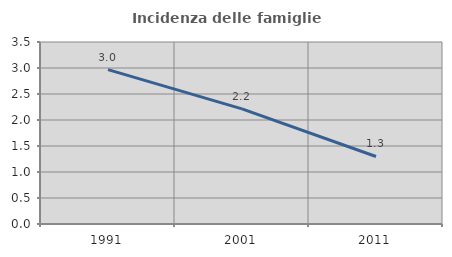
| Category | Incidenza delle famiglie numerose |
|---|---|
| 1991.0 | 2.969 |
| 2001.0 | 2.213 |
| 2011.0 | 1.298 |